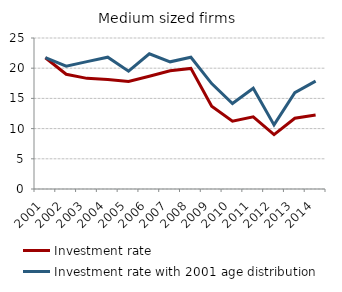
| Category | Investment rate | Investment rate with 2001 age distribution |
|---|---|---|
| 2001.0 | 21.738 | 21.738 |
| 2002.0 | 18.998 | 20.344 |
| 2003.0 | 18.319 | 21.089 |
| 2004.0 | 18.115 | 21.822 |
| 2005.0 | 17.794 | 19.502 |
| 2006.0 | 18.676 | 22.381 |
| 2007.0 | 19.561 | 21.056 |
| 2008.0 | 19.969 | 21.821 |
| 2009.0 | 13.707 | 17.454 |
| 2010.0 | 11.228 | 14.158 |
| 2011.0 | 11.948 | 16.691 |
| 2012.0 | 9.012 | 10.609 |
| 2013.0 | 11.721 | 15.944 |
| 2014.0 | 12.257 | 17.869 |